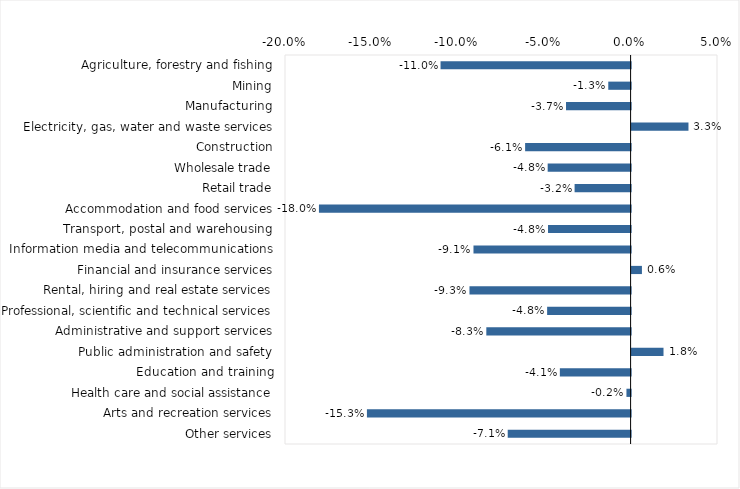
| Category | This week |
|---|---|
| Agriculture, forestry and fishing | -0.11 |
| Mining | -0.013 |
| Manufacturing | -0.037 |
| Electricity, gas, water and waste services | 0.033 |
| Construction | -0.061 |
| Wholesale trade | -0.048 |
| Retail trade | -0.032 |
| Accommodation and food services | -0.18 |
| Transport, postal and warehousing | -0.048 |
| Information media and telecommunications | -0.091 |
| Financial and insurance services | 0.006 |
| Rental, hiring and real estate services | -0.093 |
| Professional, scientific and technical services | -0.048 |
| Administrative and support services | -0.083 |
| Public administration and safety | 0.018 |
| Education and training | -0.041 |
| Health care and social assistance | -0.002 |
| Arts and recreation services | -0.153 |
| Other services | -0.071 |